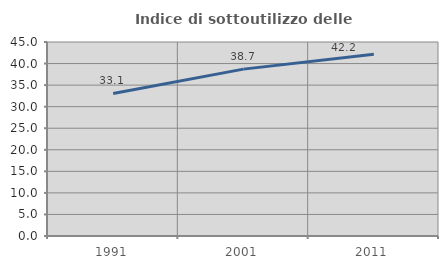
| Category | Indice di sottoutilizzo delle abitazioni  |
|---|---|
| 1991.0 | 33.067 |
| 2001.0 | 38.707 |
| 2011.0 | 42.164 |